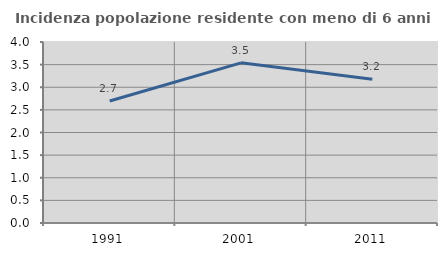
| Category | Incidenza popolazione residente con meno di 6 anni |
|---|---|
| 1991.0 | 2.696 |
| 2001.0 | 3.54 |
| 2011.0 | 3.177 |